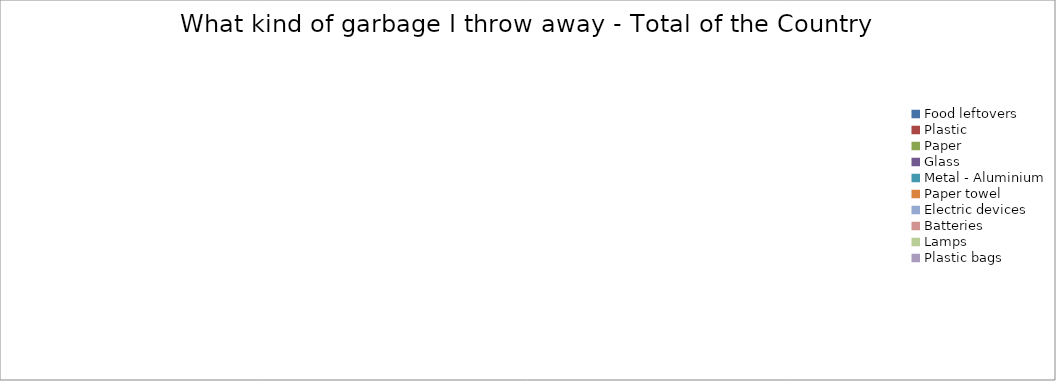
| Category | Food leftovers Plastic Paper Glass Metal - Aluminium Paper towel Electric devices Batteries Lamps Plastic bags | What kind of garbage I throw away - Total of the Country |
|---|---|---|
| Food leftovers | 0 |  |
| Plastic | 0 |  |
| Paper | 0 |  |
| Glass | 0 |  |
| Metal - Aluminium | 0 |  |
| Paper towel | 0 |  |
| Electric devices | 0 |  |
| Batteries | 0 |  |
| Lamps | 0 |  |
| Plastic bags | 0 |  |